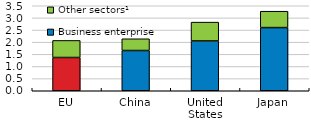
| Category | Business enterprise sector | Other sectors¹ |
|---|---|---|
| EU | 1.37 | 0.702 |
| China | 1.657 | 0.483 |
| United States | 2.051 | 0.775 |
| Japan | 2.601 | 0.674 |